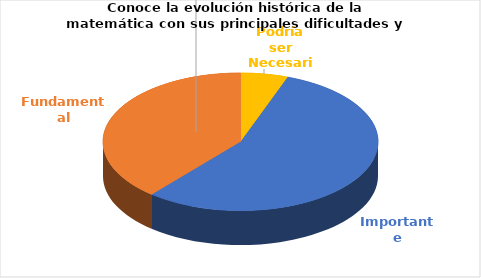
| Category | Series 0 |
|---|---|
| Podría ser Necesaria | 1 |
| Importante | 10 |
| Fundamental | 7 |